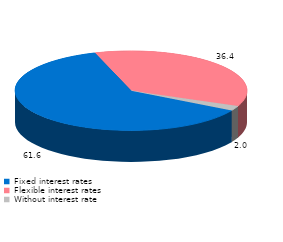
| Category | Series 0 |
|---|---|
| Fixed interest rates | 61.6 |
| Flexible interest rates | 36.4 |
| Without interest rate | 2 |